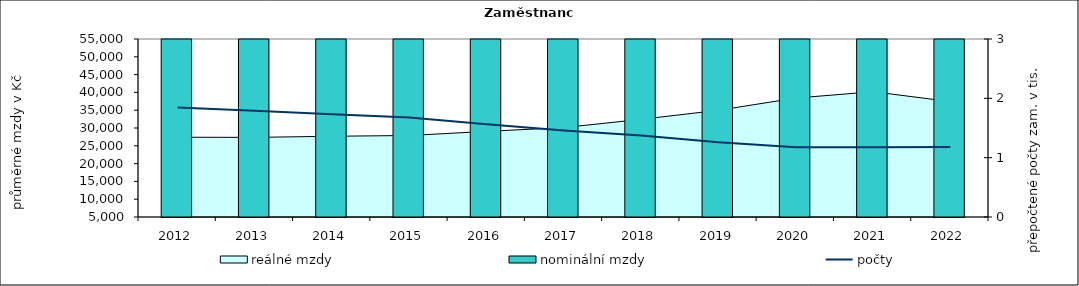
| Category | nominální mzdy  |
|---|---|
| 2012.0 | 26834.659 |
| 2013.0 | 27171.054 |
| 2014.0 | 27597.926 |
| 2015.0 | 27895.062 |
| 2016.0 | 29263.196 |
| 2017.0 | 31052.76 |
| 2018.0 | 34163.3 |
| 2019.0 | 37881.437 |
| 2020.0 | 42944.008 |
| 2021.0 | 46262.38 |
| 2022.0 | 48727.443 |